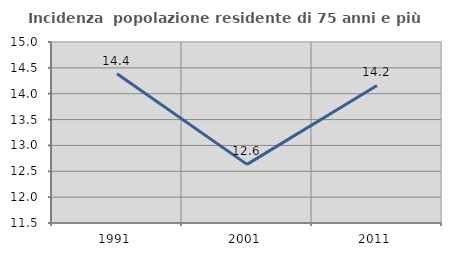
| Category | Incidenza  popolazione residente di 75 anni e più |
|---|---|
| 1991.0 | 14.386 |
| 2001.0 | 12.634 |
| 2011.0 | 14.159 |